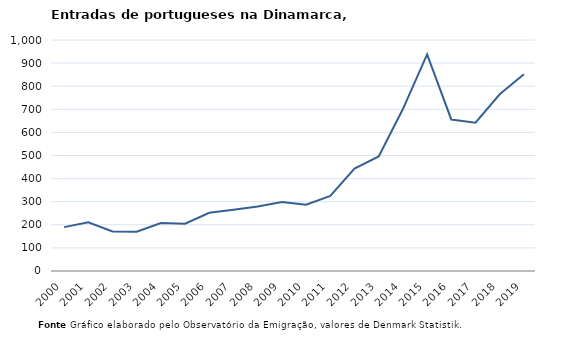
| Category | Entradas |
|---|---|
| 2000.0 | 190 |
| 2001.0 | 211 |
| 2002.0 | 171 |
| 2003.0 | 170 |
| 2004.0 | 208 |
| 2005.0 | 205 |
| 2006.0 | 252 |
| 2007.0 | 265 |
| 2008.0 | 279 |
| 2009.0 | 299 |
| 2010.0 | 287 |
| 2011.0 | 325 |
| 2012.0 | 443 |
| 2013.0 | 496 |
| 2014.0 | 701 |
| 2015.0 | 938 |
| 2016.0 | 656 |
| 2017.0 | 642 |
| 2018.0 | 765 |
| 2019.0 | 852 |